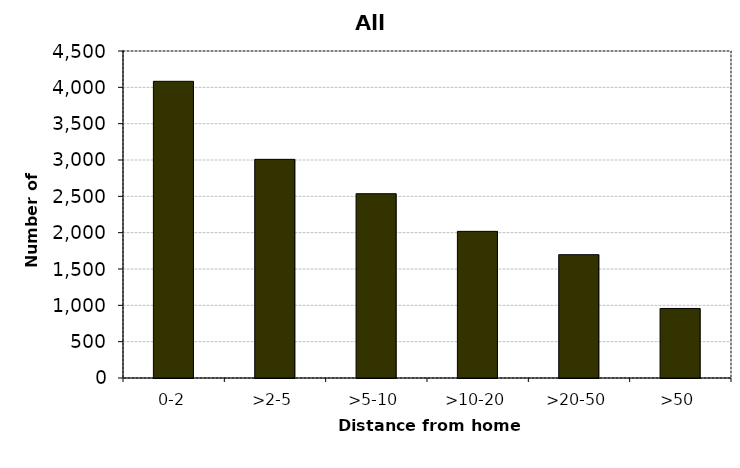
| Category | All drivers |
|---|---|
| 0-2 | 4083 |
| >2-5 | 3009 |
| >5-10 | 2536 |
| >10-20 | 2018 |
| >20-50 | 1697 |
| >50 | 957 |